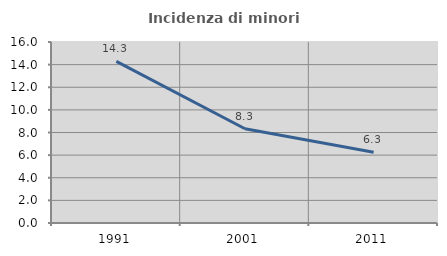
| Category | Incidenza di minori stranieri |
|---|---|
| 1991.0 | 14.286 |
| 2001.0 | 8.333 |
| 2011.0 | 6.25 |